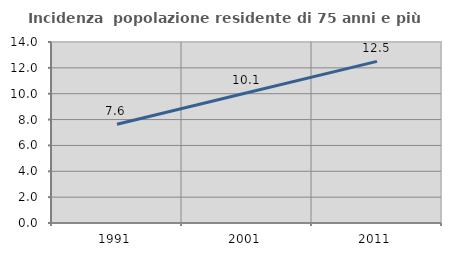
| Category | Incidenza  popolazione residente di 75 anni e più |
|---|---|
| 1991.0 | 7.635 |
| 2001.0 | 10.076 |
| 2011.0 | 12.503 |